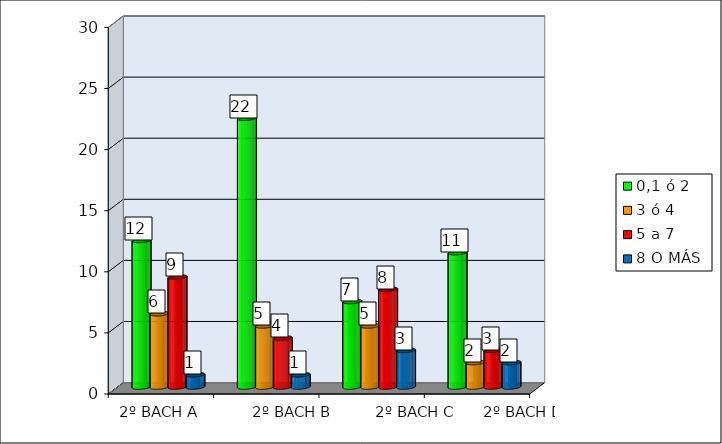
| Category | 0,1 ó 2  | 3 ó 4 | 5 a 7 | 8 O MÁS |
|---|---|---|---|---|
|  | 12 | 6 | 9 | 1 |
|  | 22 | 5 | 4 | 1 |
|  | 7 | 5 | 8 | 3 |
|  | 11 | 2 | 3 | 2 |